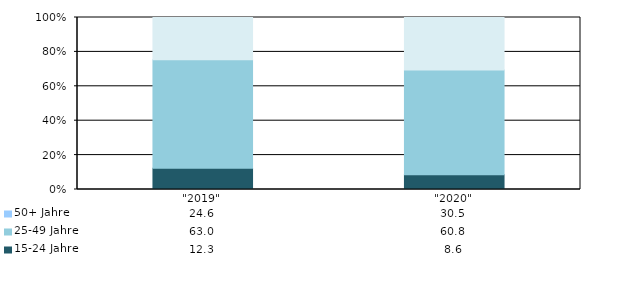
| Category | 15-24 Jahre | 25-49 Jahre | 50+ Jahre |
|---|---|---|---|
| "2019" | 12.3 | 63 | 24.6 |
| "2020" | 8.6 | 60.8 | 30.5 |